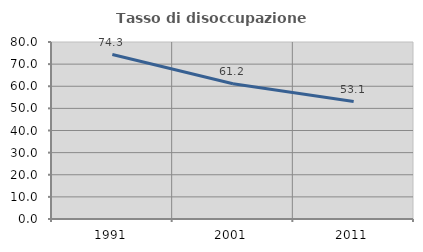
| Category | Tasso di disoccupazione giovanile  |
|---|---|
| 1991.0 | 74.331 |
| 2001.0 | 61.165 |
| 2011.0 | 53.098 |